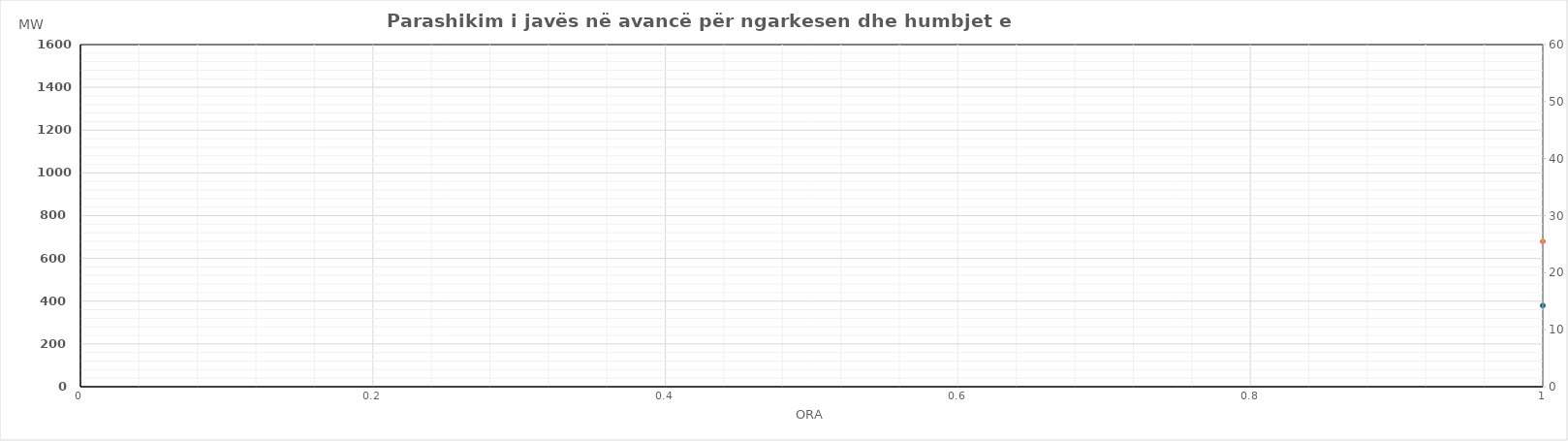
| Category | Ngarkesa (MWh) |
|---|---|
| 0 | 679.437 |
| 1 | 601.433 |
| 2 | 562.518 |
| 3 | 549.317 |
| 4 | 562.688 |
| 5 | 635.296 |
| 6 | 858.018 |
| 7 | 1159.214 |
| 8 | 1260.529 |
| 9 | 1234.002 |
| 10 | 1169.584 |
| 11 | 1105.554 |
| 12 | 1082.832 |
| 13 | 1112.025 |
| 14 | 1149.589 |
| 15 | 1181.197 |
| 16 | 1255.561 |
| 17 | 1412.022 |
| 18 | 1471.269 |
| 19 | 1461.154 |
| 20 | 1427.989 |
| 21 | 1304.382 |
| 22 | 1093.467 |
| 23 | 859.036 |
| 24 | 693.09 |
| 25 | 616.669 |
| 26 | 576.081 |
| 27 | 567.234 |
| 28 | 570.263 |
| 29 | 647.315 |
| 30 | 868.131 |
| 31 | 1179.012 |
| 32 | 1257.063 |
| 33 | 1227.482 |
| 34 | 1163.086 |
| 35 | 1112.41 |
| 36 | 1083.107 |
| 37 | 1110.943 |
| 38 | 1147.593 |
| 39 | 1190.398 |
| 40 | 1270.363 |
| 41 | 1437.985 |
| 42 | 1501.341 |
| 43 | 1495.425 |
| 44 | 1462.1 |
| 45 | 1335.813 |
| 46 | 1147.877 |
| 47 | 943.695 |
| 48 | 783.362 |
| 49 | 664.524 |
| 50 | 601.288 |
| 51 | 582.942 |
| 52 | 589.996 |
| 53 | 666.622 |
| 54 | 891.11 |
| 55 | 1203.249 |
| 56 | 1290.974 |
| 57 | 1265.103 |
| 58 | 1185.808 |
| 59 | 1121.547 |
| 60 | 1098.224 |
| 61 | 1126.929 |
| 62 | 1163.245 |
| 63 | 1191.36 |
| 64 | 1258.195 |
| 65 | 1444.951 |
| 66 | 1520.809 |
| 67 | 1517.228 |
| 68 | 1482.01 |
| 69 | 1354.628 |
| 70 | 1133.71 |
| 71 | 879.392 |
| 72 | 716.786 |
| 73 | 630.783 |
| 74 | 594.68 |
| 75 | 582.656 |
| 76 | 592.346 |
| 77 | 667.384 |
| 78 | 888.092 |
| 79 | 1203.749 |
| 80 | 1293.773 |
| 81 | 1243.611 |
| 82 | 1167.888 |
| 83 | 1107.421 |
| 84 | 1083.63 |
| 85 | 1109.889 |
| 86 | 1152.022 |
| 87 | 1190.34 |
| 88 | 1255.992 |
| 89 | 1425.611 |
| 90 | 1493.981 |
| 91 | 1484.755 |
| 92 | 1453.802 |
| 93 | 1331.089 |
| 94 | 1120.096 |
| 95 | 890.413 |
| 96 | 721.235 |
| 97 | 635.429 |
| 98 | 589.656 |
| 99 | 578.156 |
| 100 | 590.569 |
| 101 | 667.188 |
| 102 | 891.313 |
| 103 | 1193.207 |
| 104 | 1311.204 |
| 105 | 1302.877 |
| 106 | 1226.495 |
| 107 | 1150.128 |
| 108 | 1117.803 |
| 109 | 1136.973 |
| 110 | 1163.024 |
| 111 | 1176.153 |
| 112 | 1236.027 |
| 113 | 1403.163 |
| 114 | 1465.436 |
| 115 | 1444.832 |
| 116 | 1405.683 |
| 117 | 1285.448 |
| 118 | 1094.962 |
| 119 | 887.584 |
| 120 | 737.09 |
| 121 | 646.624 |
| 122 | 597.482 |
| 123 | 575.356 |
| 124 | 584.056 |
| 125 | 651.004 |
| 126 | 803.777 |
| 127 | 1034.33 |
| 128 | 1201.545 |
| 129 | 1226.132 |
| 130 | 1166.102 |
| 131 | 1105.843 |
| 132 | 1071.907 |
| 133 | 1088.47 |
| 134 | 1102.296 |
| 135 | 1131.652 |
| 136 | 1207.089 |
| 137 | 1367.367 |
| 138 | 1443.162 |
| 139 | 1426.089 |
| 140 | 1381.52 |
| 141 | 1269.269 |
| 142 | 1096.803 |
| 143 | 920.318 |
| 144 | 761.024 |
| 145 | 655.115 |
| 146 | 578.844 |
| 147 | 553.198 |
| 148 | 552.952 |
| 149 | 596.316 |
| 150 | 712.437 |
| 151 | 910.728 |
| 152 | 1089.429 |
| 153 | 1121.119 |
| 154 | 1068.019 |
| 155 | 1007.893 |
| 156 | 995.185 |
| 157 | 1002.044 |
| 158 | 998.821 |
| 159 | 1031.071 |
| 160 | 1126.973 |
| 161 | 1326.117 |
| 162 | 1414.219 |
| 163 | 1417.245 |
| 164 | 1387.266 |
| 165 | 1253.676 |
| 166 | 1064.982 |
| 167 | 845.126 |